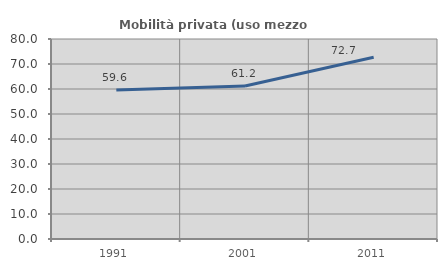
| Category | Mobilità privata (uso mezzo privato) |
|---|---|
| 1991.0 | 59.597 |
| 2001.0 | 61.202 |
| 2011.0 | 72.666 |